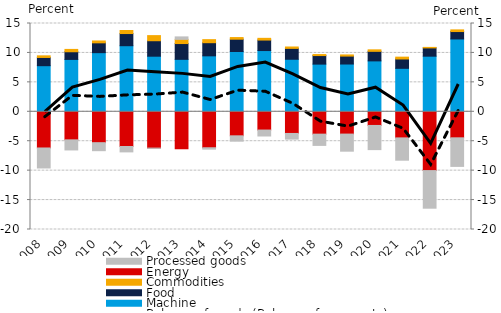
| Category | Machine | Food | Commodities | Energy | Processed goods |
|---|---|---|---|---|---|
| 2008.0 | 7.832 | 1.397 | 0.276 | -6.149 | -3.399 |
| 2009.0 | 8.898 | 1.302 | 0.399 | -4.769 | -1.716 |
| 2010.0 | 10.047 | 1.669 | 0.316 | -5.248 | -1.36 |
| 2011.0 | 11.227 | 2.067 | 0.517 | -5.899 | -0.915 |
| 2012.0 | 9.444 | 2.629 | 0.868 | -6.168 | -0.043 |
| 2013.0 | 8.911 | 2.683 | 0.709 | -6.282 | 0.42 |
| 2014.0 | 9.505 | 2.234 | 0.517 | -6.111 | -0.239 |
| 2015.0 | 10.241 | 2.09 | 0.28 | -4.085 | -0.905 |
| 2016.0 | 10.404 | 1.781 | 0.294 | -3.104 | -1.009 |
| 2017.0 | 8.923 | 1.85 | 0.235 | -3.682 | -0.959 |
| 2018.0 | 8.097 | 1.453 | 0.173 | -3.798 | -1.914 |
| 2019.0 | 8.115 | 1.348 | 0.197 | -3.788 | -2.907 |
| 2020.0 | 8.646 | 1.623 | 0.256 | -2.321 | -4.108 |
| 2021.0 | 7.384 | 1.587 | 0.312 | -4.436 | -3.789 |
| 2022.0 | 9.447 | 1.407 | 0.086 | -9.991 | -6.391 |
| 2023.0 | 12.375 | 1.259 | 0.282 | -4.423 | -4.858 |